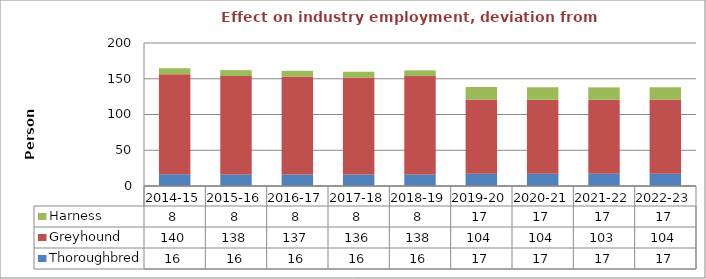
| Category | Thoroughbred | Greyhound | Harness |
|---|---|---|---|
| 2014-15 | 16.463 | 139.939 | 8.232 |
| 2015-16 | 16.199 | 137.693 | 8.1 |
| 2016-17 | 16.123 | 137.048 | 8.062 |
| 2017-18 | 15.98 | 135.833 | 7.99 |
| 2018-19 | 16.177 | 137.505 | 8.089 |
| 2019-20 | 17.302 | 103.812 | 17.302 |
| 2020-21 | 17.255 | 103.527 | 17.255 |
| 2021-22 | 17.243 | 103.456 | 17.243 |
| 2022-23 | 17.266 | 103.596 | 17.266 |